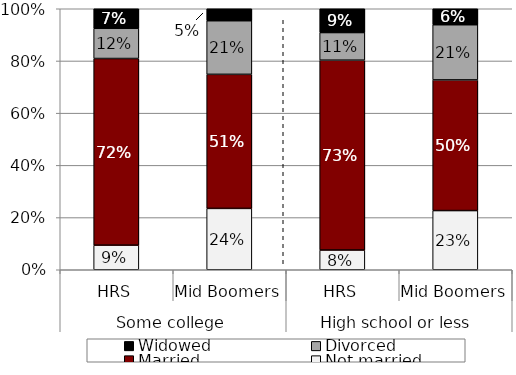
| Category | Not married | Married | Divorced | Widowed |
|---|---|---|---|---|
| 0 | 0.094 | 0.715 | 0.116 | 0.075 |
| 1 | 0.235 | 0.514 | 0.205 | 0.046 |
| 2 | 0.076 | 0.727 | 0.106 | 0.091 |
| 3 | 0.227 | 0.501 | 0.211 | 0.061 |